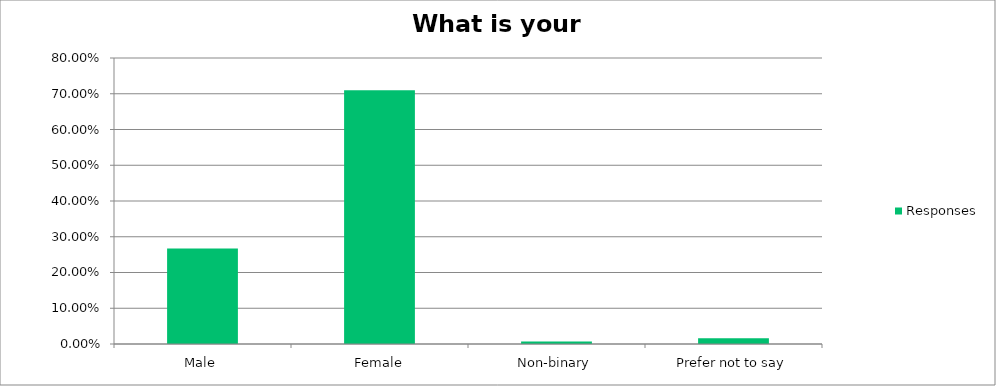
| Category | Responses |
|---|---|
| Male | 0.267 |
| Female | 0.71 |
| Non-binary | 0.007 |
| Prefer not to say | 0.016 |